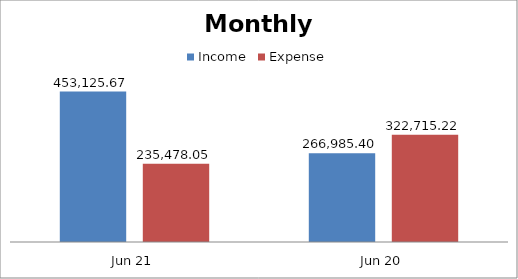
| Category | Income | Expense |
|---|---|---|
| Jun 21 | 453125.67 | 235478.05 |
| Jun 20 | 266985.4 | 322715.22 |